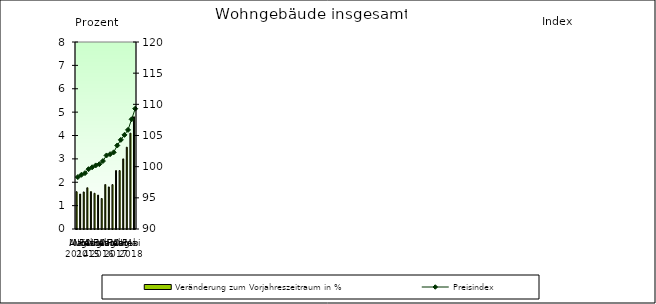
| Category | Veränderung zum Vorjahreszeitraum in % |
|---|---|
| 0 | 1.596 |
| 1 | 1.495 |
| 2 | 1.586 |
| 3 | 1.764 |
| 4 | 1.599 |
| 5 | 1.529 |
| 6 | 1.451 |
| 7 | 1.305 |
| 8 | 1.902 |
| 9 | 1.8 |
| 10 | 1.9 |
| 11 | 2.5 |
| 12 | 2.5 |
| 13 | 3 |
| 14 | 3.5 |
| 15 | 4.1 |
| 16 | 4.8 |